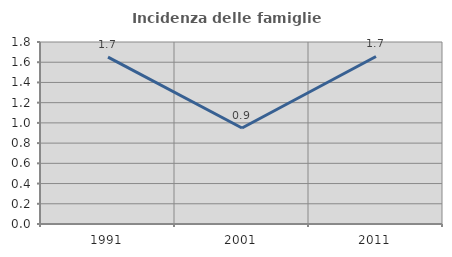
| Category | Incidenza delle famiglie numerose |
|---|---|
| 1991.0 | 1.65 |
| 2001.0 | 0.949 |
| 2011.0 | 1.657 |